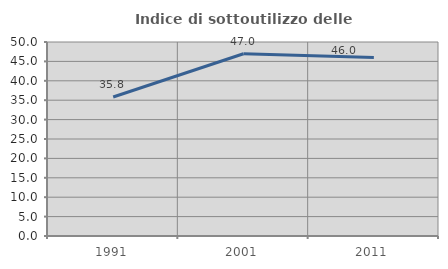
| Category | Indice di sottoutilizzo delle abitazioni  |
|---|---|
| 1991.0 | 35.823 |
| 2001.0 | 46.978 |
| 2011.0 | 46.03 |